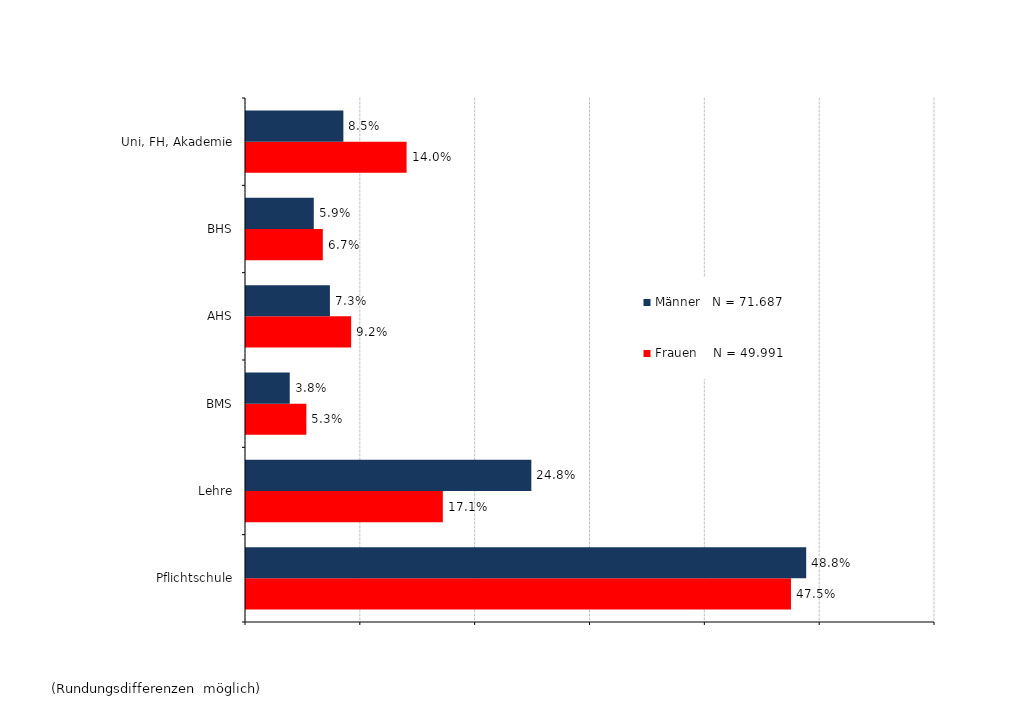
| Category | Frauen    N = 49.991 | Männer   N = 71.687 |
|---|---|---|
| Pflichtschule | 0.475 | 0.488 |
| Lehre | 0.171 | 0.248 |
| BMS | 0.053 | 0.038 |
| AHS | 0.092 | 0.073 |
| BHS | 0.067 | 0.059 |
| Uni, FH, Akademie | 0.14 | 0.085 |